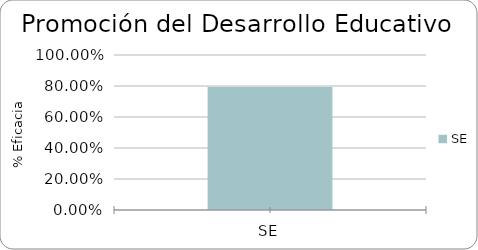
| Category | % Eficacia total |
|---|---|
| SE | 0.793 |